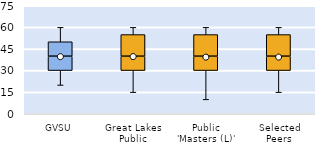
| Category | 25th | 50th | 75th |
|---|---|---|---|
| GVSU | 30 | 10 | 10 |
| Great Lakes Public | 30 | 10 | 15 |
| Public 'Masters (L)' | 30 | 10 | 15 |
| Selected Peers | 30 | 10 | 15 |